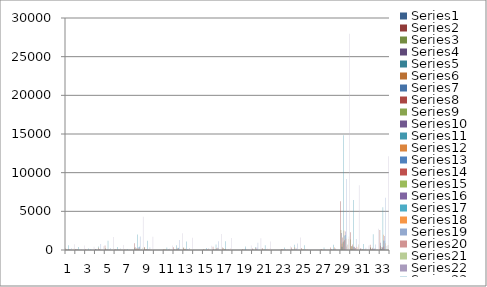
| Category | Series 0 | Series 1 | Series 2 | Series 3 | Series 4 | Series 5 | Series 6 | Series 7 | Series 8 | Series 9 | Series 10 | Series 11 | Series 12 | Series 13 | Series 14 | Series 15 | Series 16 | Series 17 | Series 18 | Series 19 | Series 20 | Series 21 | Series 22 | Series 23 | Series 24 | Series 25 | Series 26 | Series 27 |
|---|---|---|---|---|---|---|---|---|---|---|---|---|---|---|---|---|---|---|---|---|---|---|---|---|---|---|---|---|
| 0 | 0 | 200 | 95 | 50 | 0 | 45 | 20 | 20 | 70 | 130 | 630 | 30 | 0 | 105 | 0 | 20 | 60 | 20 | 235 | 0 | 0 | 0 | 0 | 160 | 10 | 0 | 170 | 740 |
| 1 | 0 | 115 | 45 | 105 | 0 | 10 | 50 | 50 | 20 | 0 | 395 | 20 | 20 | 5 | 0 | 20 | 15 | 5 | 85 | 0 | 0 | 0 | 0 | 0 | 0 | 0 | 5 | 590 |
| 2 | 0 | 100 | 10 | 40 | 0 | 10 | 0 | 30 | 0 | 0 | 190 | 0 | 0 | 0 | 0 | 0 | 120 | 0 | 120 | 0 | 0 | 0 | 0 | 0 | 0 | 0 | 0 | 435 |
| 3 | 0 | 115 | 55 | 125 | 50 | 0 | 50 | 20 | 30 | 0 | 445 | 275 | 130 | 90 | 10 | 145 | 30 | 110 | 790 | 0 | 0 | 0 | 0 | 0 | 10 | 0 | 55 | 480 |
| 4 | 0 | 580 | 240 | 140 | 40 | 10 | 20 | 135 | 10 | 30 | 1205 | 40 | 10 | 50 | 0 | 40 | 90 | 40 | 270 | 0 | 0 | 0 | 10 | 10 | 0 | 20 | 185 | 1680 |
| 5 | 0 | 80 | 40 | 100 | 0 | 10 | 10 | 55 | 60 | 30 | 385 | 20 | 30 | 20 | 0 | 20 | 30 | 80 | 200 | 10 | 20 | 0 | 0 | 0 | 0 | 30 | 30 | 645 |
| 6 | 0 | 60 | 0 | 40 | 0 | 0 | 0 | 20 | 0 | 0 | 120 | 0 | 0 | 0 | 0 | 0 | 0 | 0 | 0 | 0 | 0 | 0 | 0 | 0 | 0 | 0 | 0 | 120 |
| 7 | 0 | 880 | 300 | 360 | 60 | 20 | 30 | 230 | 70 | 60 | 2010 | 210 | 350 | 150 | 0 | 380 | 460 | 210 | 1760 | 10 | 20 | 0 | 130 | 50 | 0 | 210 | 285 | 4285 |
| 8 | 0 | 400 | 290 | 120 | 0 | 65 | 40 | 125 | 80 | 60 | 1180 | 40 | 60 | 80 | 0 | 75 | 20 | 80 | 355 | 40 | 0 | 0 | 0 | 20 | 20 | 80 | 95 | 1710 |
| 9 | 0 | 0 | 0 | 0 | 0 | 0 | 0 | 0 | 0 | 0 | 0 | 0 | 0 | 0 | 0 | 0 | 0 | 0 | 0 | 0 | 0 | 0 | 0 | 0 | 0 | 0 | 0 | 0 |
| 10 | 0 | 115 | 80 | 0 | 0 | 75 | 0 | 35 | 30 | 0 | 335 | 10 | 10 | 15 | 0 | 55 | 65 | 20 | 175 | 0 | 0 | 0 | 0 | 40 | 0 | 40 | 40 | 590 |
| 11 | 0 | 350 | 40 | 80 | 30 | 0 | 0 | 30 | 20 | 80 | 630 | 290 | 200 | 80 | 30 | 270 | 300 | 130 | 1300 | 0 | 0 | 0 | 120 | 20 | 0 | 140 | 80 | 2150 |
| 12 | 0 | 300 | 310 | 100 | 40 | 120 | 40 | 150 | 20 | 30 | 1110 | 0 | 130 | 40 | 0 | 40 | 20 | 40 | 270 | 20 | 0 | 0 | 0 | 20 | 20 | 60 | 140 | 1580 |
| 13 | 0 | 0 | 0 | 0 | 0 | 0 | 0 | 0 | 0 | 0 | 0 | 0 | 0 | 0 | 0 | 0 | 0 | 0 | 0 | 0 | 0 | 0 | 0 | 0 | 0 | 0 | 0 | 0 |
| 14 | 0 | 80 | 70 | 30 | 20 | 20 | 0 | 40 | 0 | 10 | 270 | 0 | 10 | 50 | 0 | 40 | 10 | 120 | 230 | 0 | 0 | 0 | 0 | 10 | 0 | 10 | 30 | 540 |
| 15 | 0 | 430 | 40 | 90 | 0 | 40 | 0 | 30 | 40 | 50 | 720 | 255 | 130 | 40 | 0 | 300 | 200 | 220 | 1145 | 0 | 0 | 0 | 90 | 20 | 0 | 110 | 90 | 2065 |
| 16 | 0 | 315 | 255 | 40 | 0 | 90 | 0 | 140 | 120 | 160 | 1120 | 40 | 0 | 20 | 0 | 0 | 70 | 0 | 130 | 120 | 0 | 0 | 20 | 40 | 40 | 220 | 90 | 1560 |
| 17 | 0 | 0 | 0 | 0 | 0 | 0 | 0 | 0 | 0 | 0 | 0 | 0 | 0 | 0 | 0 | 0 | 0 | 0 | 0 | 0 | 0 | 0 | 0 | 0 | 0 | 0 | 0 | 0 |
| 18 | 0 | 100 | 70 | 30 | 40 | 0 | 0 | 40 | 20 | 160 | 460 | 0 | 60 | 0 | 0 | 40 | 0 | 0 | 100 | 0 | 0 | 0 | 20 | 0 | 0 | 20 | 0 | 580 |
| 19 | 0 | 180 | 10 | 120 | 20 | 30 | 0 | 10 | 20 | 0 | 390 | 230 | 120 | 90 | 10 | 320 | 140 | 30 | 940 | 0 | 0 | 0 | 110 | 20 | 0 | 130 | 55 | 1515 |
| 20 | 0 | 250 | 80 | 20 | 20 | 80 | 0 | 70 | 90 | 0 | 610 | 0 | 70 | 60 | 0 | 20 | 0 | 20 | 170 | 120 | 0 | 0 | 20 | 100 | 0 | 240 | 80 | 1100 |
| 21 | 0 | 0 | 0 | 0 | 0 | 0 | 0 | 0 | 0 | 0 | 0 | 0 | 0 | 0 | 0 | 0 | 0 | 0 | 0 | 0 | 0 | 0 | 0 | 0 | 0 | 0 | 0 | 0 |
| 22 | 0 | 120 | 75 | 60 | 0 | 20 | 0 | 60 | 0 | 0 | 335 | 10 | 20 | 60 | 0 | 0 | 0 | 0 | 90 | 0 | 0 | 0 | 40 | 0 | 0 | 40 | 20 | 485 |
| 23 | 0 | 320 | 60 | 80 | 20 | 0 | 20 | 40 | 40 | 90 | 670 | 360 | 150 | 0 | 0 | 200 | 40 | 80 | 830 | 0 | 0 | 0 | 40 | 20 | 0 | 60 | 70 | 1630 |
| 24 | 0 | 250 | 80 | 20 | 20 | 80 | 0 | 70 | 90 | 0 | 610 | 0 | 70 | 60 | 0 | 20 | 0 | 20 | 0 | 120 | 0 | 0 | 20 | 0 | 100 | 0 | 0 | 80 |
| 25 | 0 | 0 | 0 | 0 | 0 | 0 | 0 | 0 | 0 | 0 | 0 | 0 | 0 | 0 | 0 | 0 | 0 | 0 | 0 | 0 | 0 | 0 | 0 | 0 | 0 | 0 | 0 | 0 |
| 26 | 0 | 120 | 75 | 60 | 0 | 20 | 0 | 60 | 0 | 0 | 335 | 10 | 20 | 60 | 0 | 0 | 0 | 0 | 0 | 0 | 0 | 0 | 40 | 0 | 0 | 0 | 0 | 20 |
| 27 | 0 | 320 | 60 | 80 | 20 | 0 | 20 | 40 | 40 | 90 | 670 | 360 | 150 | 0 | 0 | 200 | 40 | 80 | 0 | 0 | 0 | 0 | 40 | 0 | 20 | 0 | 0 | 70 |
| 28 | 0 | 6310 | 2585 | 2210 | 430 | 810 | 420 | 1620 | 990 | 1110 | 14825 | 2525 | 1890 | 1275 | 60 | 2390 | 1935 | 1440 | 9195 | 440 | 40 | 0 | 700 | 690 | 240 | 1410 | 1750 | 27950 |
| 29 | 0 | 2295 | 1350 | 490 | 120 | 490 | 120 | 710 | 480 | 410 | 6465 | 150 | 340 | 415 | 0 | 215 | 260 | 220 | 1430 | 420 | 0 | 0 | 70 | 350 | 190 | 620 | 760 | 8370 |
| 30 | 0 | 195 | 85 | 205 | 0 | 20 | 60 | 105 | 80 | 30 | 780 | 40 | 50 | 25 | 0 | 40 | 45 | 85 | 285 | 10 | 20 | 0 | 0 | 0 | 0 | 30 | 35 | 590 |
| 31 | 0 | 695 | 380 | 260 | 60 | 145 | 0 | 285 | 50 | 170 | 2045 | 30 | 120 | 185 | 0 | 135 | 195 | 140 | 715 | 0 | 0 | 0 | 100 | 50 | 0 | 110 | 90 | 2750 |
| 32 | 0 | 2595 | 565 | 935 | 200 | 90 | 120 | 400 | 260 | 370 | 5535 | 1980 | 1230 | 450 | 50 | 1815 | 1210 | 860 | 6765 | 10 | 20 | 0 | 530 | 130 | 30 | 650 | 635 | 12125 |